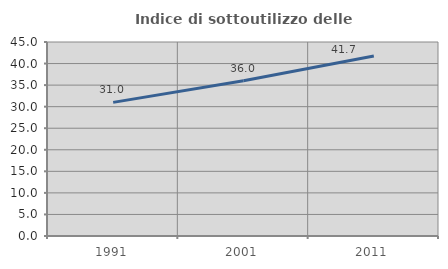
| Category | Indice di sottoutilizzo delle abitazioni  |
|---|---|
| 1991.0 | 30.999 |
| 2001.0 | 35.99 |
| 2011.0 | 41.735 |